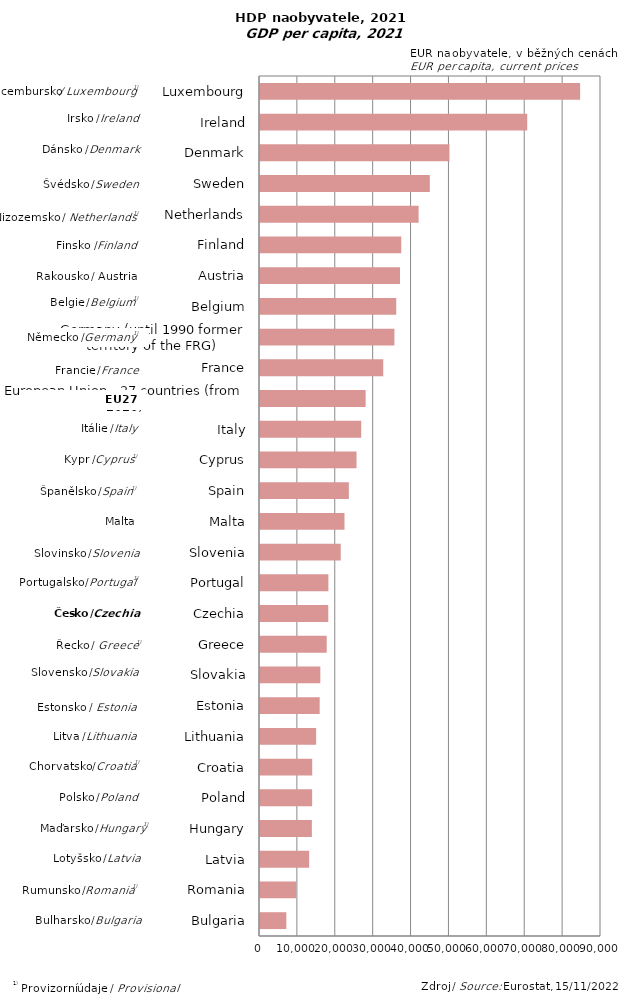
| Category | Series 0 |
|---|---|
| Bulgaria | 6950 |
| Romania | 9550 |
| Latvia | 12970 |
| Hungary | 13690 |
| Poland | 13760 |
| Croatia | 13780 |
| Lithuania | 14820 |
| Estonia | 15750 |
| Slovakia | 15920 |
| Greece | 17610 |
| Czechia | 18020 |
| Portugal | 18050 |
| Slovenia | 21310 |
| Malta | 22300 |
| Spain | 23450 |
| Cyprus | 25480 |
| Italy | 26710 |
| European Union - 27 countries (from 2020) | 27880 |
| France | 32530 |
| Germany (until 1990 former territory of the FRG) | 35480 |
| Belgium | 35960 |
| Austria | 36950 |
| Finland | 37280 |
| Netherlands | 41860 |
| Sweden | 44820 |
| Denmark | 50010 |
| Ireland | 70530 |
| Luxembourg | 84490 |